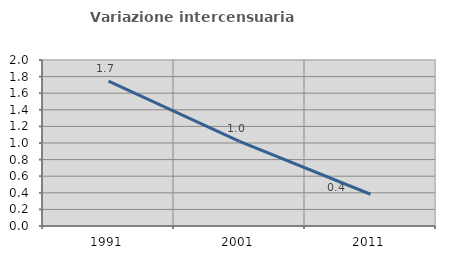
| Category | Variazione intercensuaria annua |
|---|---|
| 1991.0 | 1.745 |
| 2001.0 | 1.019 |
| 2011.0 | 0.383 |